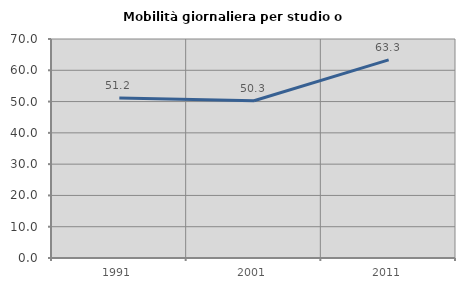
| Category | Mobilità giornaliera per studio o lavoro |
|---|---|
| 1991.0 | 51.167 |
| 2001.0 | 50.273 |
| 2011.0 | 63.34 |